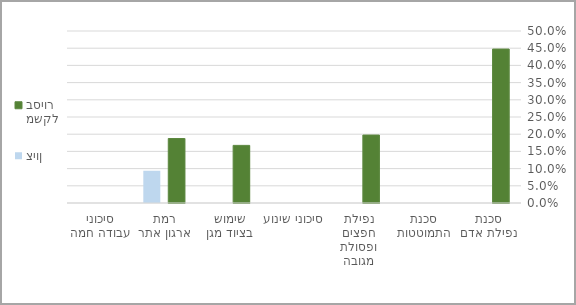
| Category | משקל בסיור | ציון |
|---|---|---|
| סכנת נפילת אדם | 0.448 | 0 |
| סכנת התמוטטות | 0 | 0 |
| נפילת חפצים ופסולת מגובה | 0.198 | 0 |
| סיכוני שינוע | 0 | 0 |
| שימוש בציוד מגן | 0.167 | 0 |
| רמת ארגון אתר | 0.188 | 0.094 |
| סיכוני עבודה חמה | 0 | 0 |